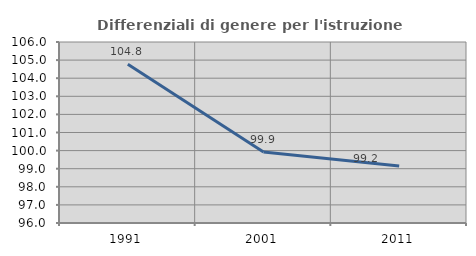
| Category | Differenziali di genere per l'istruzione superiore |
|---|---|
| 1991.0 | 104.771 |
| 2001.0 | 99.926 |
| 2011.0 | 99.154 |